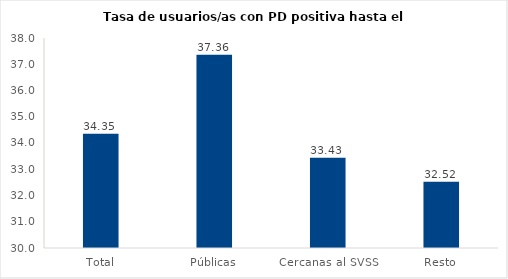
| Category | Series 0 |
|---|---|
| Total | 34.355 |
| Públicas | 37.361 |
| Cercanas al SVSS | 33.434 |
| Resto | 32.52 |